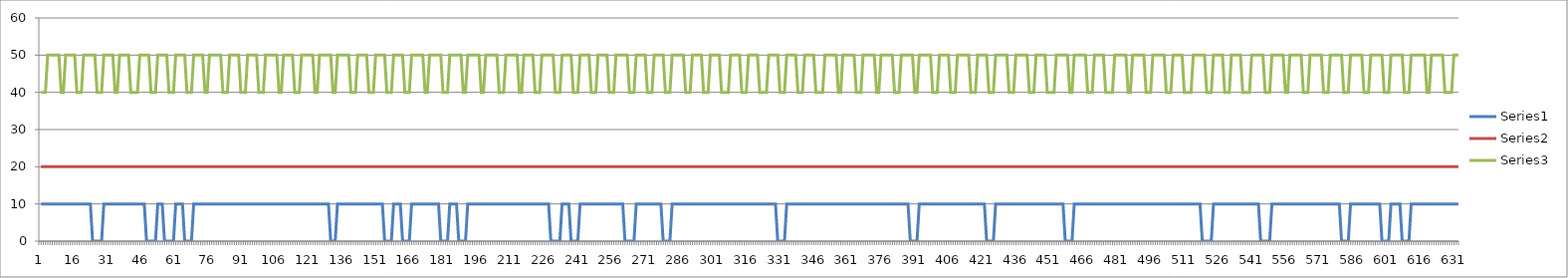
| Category | Series 0 | Series 1 | Series 2 |
|---|---|---|---|
| 0 | 10 | 20 | 40 |
| 1 | 10 | 20 | 40 |
| 2 | 10 | 20 | 40 |
| 3 | 10 | 20 | 50 |
| 4 | 10 | 20 | 50 |
| 5 | 10 | 20 | 50 |
| 6 | 10 | 20 | 50 |
| 7 | 10 | 20 | 50 |
| 8 | 10 | 20 | 50 |
| 9 | 10 | 20 | 40 |
| 10 | 10 | 20 | 40 |
| 11 | 10 | 20 | 50 |
| 12 | 10 | 20 | 50 |
| 13 | 10 | 20 | 50 |
| 14 | 10 | 20 | 50 |
| 15 | 10 | 20 | 50 |
| 16 | 10 | 20 | 40 |
| 17 | 10 | 20 | 40 |
| 18 | 10 | 20 | 40 |
| 19 | 10 | 20 | 50 |
| 20 | 10 | 20 | 50 |
| 21 | 10 | 20 | 50 |
| 22 | 10 | 20 | 50 |
| 23 | 0 | 20 | 50 |
| 24 | 0 | 20 | 50 |
| 25 | 0 | 20 | 40 |
| 26 | 0 | 20 | 40 |
| 27 | 0 | 20 | 40 |
| 28 | 10 | 20 | 50 |
| 29 | 10 | 20 | 50 |
| 30 | 10 | 20 | 50 |
| 31 | 10 | 20 | 50 |
| 32 | 10 | 20 | 50 |
| 33 | 10 | 20 | 40 |
| 34 | 10 | 20 | 40 |
| 35 | 10 | 20 | 50 |
| 36 | 10 | 20 | 50 |
| 37 | 10 | 20 | 50 |
| 38 | 10 | 20 | 50 |
| 39 | 10 | 20 | 50 |
| 40 | 10 | 20 | 40 |
| 41 | 10 | 20 | 40 |
| 42 | 10 | 20 | 40 |
| 43 | 10 | 20 | 40 |
| 44 | 10 | 20 | 50 |
| 45 | 10 | 20 | 50 |
| 46 | 10 | 20 | 50 |
| 47 | 0 | 20 | 50 |
| 48 | 0 | 20 | 50 |
| 49 | 0 | 20 | 40 |
| 50 | 0 | 20 | 40 |
| 51 | 0 | 20 | 40 |
| 52 | 10 | 20 | 50 |
| 53 | 10 | 20 | 50 |
| 54 | 10 | 20 | 50 |
| 55 | 0 | 20 | 50 |
| 56 | 0 | 20 | 50 |
| 57 | 0 | 20 | 40 |
| 58 | 0 | 20 | 40 |
| 59 | 0 | 20 | 40 |
| 60 | 10 | 20 | 50 |
| 61 | 10 | 20 | 50 |
| 62 | 10 | 20 | 50 |
| 63 | 10 | 20 | 50 |
| 64 | 0 | 20 | 50 |
| 65 | 0 | 20 | 40 |
| 66 | 0 | 20 | 40 |
| 67 | 0 | 20 | 40 |
| 68 | 10 | 20 | 50 |
| 69 | 10 | 20 | 50 |
| 70 | 10 | 20 | 50 |
| 71 | 10 | 20 | 50 |
| 72 | 10 | 20 | 50 |
| 73 | 10 | 20 | 40 |
| 74 | 10 | 20 | 40 |
| 75 | 10 | 20 | 50 |
| 76 | 10 | 20 | 50 |
| 77 | 10 | 20 | 50 |
| 78 | 10 | 20 | 50 |
| 79 | 10 | 20 | 50 |
| 80 | 10 | 20 | 50 |
| 81 | 10 | 20 | 40 |
| 82 | 10 | 20 | 40 |
| 83 | 10 | 20 | 40 |
| 84 | 10 | 20 | 50 |
| 85 | 10 | 20 | 50 |
| 86 | 10 | 20 | 50 |
| 87 | 10 | 20 | 50 |
| 88 | 10 | 20 | 50 |
| 89 | 10 | 20 | 40 |
| 90 | 10 | 20 | 40 |
| 91 | 10 | 20 | 40 |
| 92 | 10 | 20 | 50 |
| 93 | 10 | 20 | 50 |
| 94 | 10 | 20 | 50 |
| 95 | 10 | 20 | 50 |
| 96 | 10 | 20 | 50 |
| 97 | 10 | 20 | 40 |
| 98 | 10 | 20 | 40 |
| 99 | 10 | 20 | 40 |
| 100 | 10 | 20 | 50 |
| 101 | 10 | 20 | 50 |
| 102 | 10 | 20 | 50 |
| 103 | 10 | 20 | 50 |
| 104 | 10 | 20 | 50 |
| 105 | 10 | 20 | 50 |
| 106 | 10 | 20 | 40 |
| 107 | 10 | 20 | 40 |
| 108 | 10 | 20 | 50 |
| 109 | 10 | 20 | 50 |
| 110 | 10 | 20 | 50 |
| 111 | 10 | 20 | 50 |
| 112 | 10 | 20 | 50 |
| 113 | 10 | 20 | 40 |
| 114 | 10 | 20 | 40 |
| 115 | 10 | 20 | 40 |
| 116 | 10 | 20 | 50 |
| 117 | 10 | 20 | 50 |
| 118 | 10 | 20 | 50 |
| 119 | 10 | 20 | 50 |
| 120 | 10 | 20 | 50 |
| 121 | 10 | 20 | 50 |
| 122 | 10 | 20 | 40 |
| 123 | 10 | 20 | 40 |
| 124 | 10 | 20 | 50 |
| 125 | 10 | 20 | 50 |
| 126 | 10 | 20 | 50 |
| 127 | 10 | 20 | 50 |
| 128 | 10 | 20 | 50 |
| 129 | 0 | 20 | 50 |
| 130 | 0 | 20 | 40 |
| 131 | 0 | 20 | 40 |
| 132 | 10 | 20 | 50 |
| 133 | 10 | 20 | 50 |
| 134 | 10 | 20 | 50 |
| 135 | 10 | 20 | 50 |
| 136 | 10 | 20 | 50 |
| 137 | 10 | 20 | 50 |
| 138 | 10 | 20 | 40 |
| 139 | 10 | 20 | 40 |
| 140 | 10 | 20 | 40 |
| 141 | 10 | 20 | 50 |
| 142 | 10 | 20 | 50 |
| 143 | 10 | 20 | 50 |
| 144 | 10 | 20 | 50 |
| 145 | 10 | 20 | 50 |
| 146 | 10 | 20 | 40 |
| 147 | 10 | 20 | 40 |
| 148 | 10 | 20 | 40 |
| 149 | 10 | 20 | 50 |
| 150 | 10 | 20 | 50 |
| 151 | 10 | 20 | 50 |
| 152 | 10 | 20 | 50 |
| 153 | 0 | 20 | 50 |
| 154 | 0 | 20 | 40 |
| 155 | 0 | 20 | 40 |
| 156 | 0 | 20 | 40 |
| 157 | 10 | 20 | 50 |
| 158 | 10 | 20 | 50 |
| 159 | 10 | 20 | 50 |
| 160 | 10 | 20 | 50 |
| 161 | 0 | 20 | 50 |
| 162 | 0 | 20 | 40 |
| 163 | 0 | 20 | 40 |
| 164 | 0 | 20 | 40 |
| 165 | 10 | 20 | 50 |
| 166 | 10 | 20 | 50 |
| 167 | 10 | 20 | 50 |
| 168 | 10 | 20 | 50 |
| 169 | 10 | 20 | 50 |
| 170 | 10 | 20 | 50 |
| 171 | 10 | 20 | 40 |
| 172 | 10 | 20 | 40 |
| 173 | 10 | 20 | 50 |
| 174 | 10 | 20 | 50 |
| 175 | 10 | 20 | 50 |
| 176 | 10 | 20 | 50 |
| 177 | 10 | 20 | 50 |
| 178 | 0 | 20 | 50 |
| 179 | 0 | 20 | 40 |
| 180 | 0 | 20 | 40 |
| 181 | 0 | 20 | 40 |
| 182 | 10 | 20 | 50 |
| 183 | 10 | 20 | 50 |
| 184 | 10 | 20 | 50 |
| 185 | 10 | 20 | 50 |
| 186 | 0 | 20 | 50 |
| 187 | 0 | 20 | 50 |
| 188 | 0 | 20 | 40 |
| 189 | 0 | 20 | 40 |
| 190 | 10 | 20 | 50 |
| 191 | 10 | 20 | 50 |
| 192 | 10 | 20 | 50 |
| 193 | 10 | 20 | 50 |
| 194 | 10 | 20 | 50 |
| 195 | 10 | 20 | 50 |
| 196 | 10 | 20 | 40 |
| 197 | 10 | 20 | 40 |
| 198 | 10 | 20 | 50 |
| 199 | 10 | 20 | 50 |
| 200 | 10 | 20 | 50 |
| 201 | 10 | 20 | 50 |
| 202 | 10 | 20 | 50 |
| 203 | 10 | 20 | 50 |
| 204 | 10 | 20 | 40 |
| 205 | 10 | 20 | 40 |
| 206 | 10 | 20 | 40 |
| 207 | 10 | 20 | 50 |
| 208 | 10 | 20 | 50 |
| 209 | 10 | 20 | 50 |
| 210 | 10 | 20 | 50 |
| 211 | 10 | 20 | 50 |
| 212 | 10 | 20 | 50 |
| 213 | 10 | 20 | 40 |
| 214 | 10 | 20 | 40 |
| 215 | 10 | 20 | 50 |
| 216 | 10 | 20 | 50 |
| 217 | 10 | 20 | 50 |
| 218 | 10 | 20 | 50 |
| 219 | 10 | 20 | 50 |
| 220 | 10 | 20 | 40 |
| 221 | 10 | 20 | 40 |
| 222 | 10 | 20 | 40 |
| 223 | 10 | 20 | 50 |
| 224 | 10 | 20 | 50 |
| 225 | 10 | 20 | 50 |
| 226 | 10 | 20 | 50 |
| 227 | 0 | 20 | 50 |
| 228 | 0 | 20 | 50 |
| 229 | 0 | 20 | 40 |
| 230 | 0 | 20 | 40 |
| 231 | 0 | 20 | 40 |
| 232 | 10 | 20 | 50 |
| 233 | 10 | 20 | 50 |
| 234 | 10 | 20 | 50 |
| 235 | 10 | 20 | 50 |
| 236 | 0 | 20 | 50 |
| 237 | 0 | 20 | 40 |
| 238 | 0 | 20 | 40 |
| 239 | 0 | 20 | 40 |
| 240 | 10 | 20 | 50 |
| 241 | 10 | 20 | 50 |
| 242 | 10 | 20 | 50 |
| 243 | 10 | 20 | 50 |
| 244 | 10 | 20 | 50 |
| 245 | 10 | 20 | 40 |
| 246 | 10 | 20 | 40 |
| 247 | 10 | 20 | 40 |
| 248 | 10 | 20 | 50 |
| 249 | 10 | 20 | 50 |
| 250 | 10 | 20 | 50 |
| 251 | 10 | 20 | 50 |
| 252 | 10 | 20 | 50 |
| 253 | 10 | 20 | 40 |
| 254 | 10 | 20 | 40 |
| 255 | 10 | 20 | 40 |
| 256 | 10 | 20 | 50 |
| 257 | 10 | 20 | 50 |
| 258 | 10 | 20 | 50 |
| 259 | 10 | 20 | 50 |
| 260 | 0 | 20 | 50 |
| 261 | 0 | 20 | 50 |
| 262 | 0 | 20 | 40 |
| 263 | 0 | 20 | 40 |
| 264 | 0 | 20 | 40 |
| 265 | 10 | 20 | 50 |
| 266 | 10 | 20 | 50 |
| 267 | 10 | 20 | 50 |
| 268 | 10 | 20 | 50 |
| 269 | 10 | 20 | 50 |
| 270 | 10 | 20 | 40 |
| 271 | 10 | 20 | 40 |
| 272 | 10 | 20 | 40 |
| 273 | 10 | 20 | 50 |
| 274 | 10 | 20 | 50 |
| 275 | 10 | 20 | 50 |
| 276 | 10 | 20 | 50 |
| 277 | 0 | 20 | 50 |
| 278 | 0 | 20 | 40 |
| 279 | 0 | 20 | 40 |
| 280 | 0 | 20 | 40 |
| 281 | 10 | 20 | 50 |
| 282 | 10 | 20 | 50 |
| 283 | 10 | 20 | 50 |
| 284 | 10 | 20 | 50 |
| 285 | 10 | 20 | 50 |
| 286 | 10 | 20 | 50 |
| 287 | 10 | 20 | 40 |
| 288 | 10 | 20 | 40 |
| 289 | 10 | 20 | 40 |
| 290 | 10 | 20 | 50 |
| 291 | 10 | 20 | 50 |
| 292 | 10 | 20 | 50 |
| 293 | 10 | 20 | 50 |
| 294 | 10 | 20 | 50 |
| 295 | 10 | 20 | 40 |
| 296 | 10 | 20 | 40 |
| 297 | 10 | 20 | 40 |
| 298 | 10 | 20 | 50 |
| 299 | 10 | 20 | 50 |
| 300 | 10 | 20 | 50 |
| 301 | 10 | 20 | 50 |
| 302 | 10 | 20 | 50 |
| 303 | 10 | 20 | 40 |
| 304 | 10 | 20 | 40 |
| 305 | 10 | 20 | 40 |
| 306 | 10 | 20 | 40 |
| 307 | 10 | 20 | 50 |
| 308 | 10 | 20 | 50 |
| 309 | 10 | 20 | 50 |
| 310 | 10 | 20 | 50 |
| 311 | 10 | 20 | 50 |
| 312 | 10 | 20 | 40 |
| 313 | 10 | 20 | 40 |
| 314 | 10 | 20 | 40 |
| 315 | 10 | 20 | 50 |
| 316 | 10 | 20 | 50 |
| 317 | 10 | 20 | 50 |
| 318 | 10 | 20 | 50 |
| 319 | 10 | 20 | 50 |
| 320 | 10 | 20 | 40 |
| 321 | 10 | 20 | 40 |
| 322 | 10 | 20 | 40 |
| 323 | 10 | 20 | 40 |
| 324 | 10 | 20 | 50 |
| 325 | 10 | 20 | 50 |
| 326 | 10 | 20 | 50 |
| 327 | 10 | 20 | 50 |
| 328 | 0 | 20 | 50 |
| 329 | 0 | 20 | 40 |
| 330 | 0 | 20 | 40 |
| 331 | 0 | 20 | 40 |
| 332 | 10 | 20 | 50 |
| 333 | 10 | 20 | 50 |
| 334 | 10 | 20 | 50 |
| 335 | 10 | 20 | 50 |
| 336 | 10 | 20 | 50 |
| 337 | 10 | 20 | 40 |
| 338 | 10 | 20 | 40 |
| 339 | 10 | 20 | 40 |
| 340 | 10 | 20 | 50 |
| 341 | 10 | 20 | 50 |
| 342 | 10 | 20 | 50 |
| 343 | 10 | 20 | 50 |
| 344 | 10 | 20 | 50 |
| 345 | 10 | 20 | 40 |
| 346 | 10 | 20 | 40 |
| 347 | 10 | 20 | 40 |
| 348 | 10 | 20 | 40 |
| 349 | 10 | 20 | 50 |
| 350 | 10 | 20 | 50 |
| 351 | 10 | 20 | 50 |
| 352 | 10 | 20 | 50 |
| 353 | 10 | 20 | 50 |
| 354 | 10 | 20 | 50 |
| 355 | 10 | 20 | 40 |
| 356 | 10 | 20 | 40 |
| 357 | 10 | 20 | 50 |
| 358 | 10 | 20 | 50 |
| 359 | 10 | 20 | 50 |
| 360 | 10 | 20 | 50 |
| 361 | 10 | 20 | 50 |
| 362 | 10 | 20 | 50 |
| 363 | 10 | 20 | 40 |
| 364 | 10 | 20 | 40 |
| 365 | 10 | 20 | 40 |
| 366 | 10 | 20 | 50 |
| 367 | 10 | 20 | 50 |
| 368 | 10 | 20 | 50 |
| 369 | 10 | 20 | 50 |
| 370 | 10 | 20 | 50 |
| 371 | 10 | 20 | 50 |
| 372 | 10 | 20 | 40 |
| 373 | 10 | 20 | 40 |
| 374 | 10 | 20 | 50 |
| 375 | 10 | 20 | 50 |
| 376 | 10 | 20 | 50 |
| 377 | 10 | 20 | 50 |
| 378 | 10 | 20 | 50 |
| 379 | 10 | 20 | 50 |
| 380 | 10 | 20 | 40 |
| 381 | 10 | 20 | 40 |
| 382 | 10 | 20 | 40 |
| 383 | 10 | 20 | 50 |
| 384 | 10 | 20 | 50 |
| 385 | 10 | 20 | 50 |
| 386 | 10 | 20 | 50 |
| 387 | 0 | 20 | 50 |
| 388 | 0 | 20 | 50 |
| 389 | 0 | 20 | 40 |
| 390 | 0 | 20 | 40 |
| 391 | 10 | 20 | 50 |
| 392 | 10 | 20 | 50 |
| 393 | 10 | 20 | 50 |
| 394 | 10 | 20 | 50 |
| 395 | 10 | 20 | 50 |
| 396 | 10 | 20 | 50 |
| 397 | 10 | 20 | 40 |
| 398 | 10 | 20 | 40 |
| 399 | 10 | 20 | 40 |
| 400 | 10 | 20 | 50 |
| 401 | 10 | 20 | 50 |
| 402 | 10 | 20 | 50 |
| 403 | 10 | 20 | 50 |
| 404 | 10 | 20 | 50 |
| 405 | 10 | 20 | 40 |
| 406 | 10 | 20 | 40 |
| 407 | 10 | 20 | 40 |
| 408 | 10 | 20 | 50 |
| 409 | 10 | 20 | 50 |
| 410 | 10 | 20 | 50 |
| 411 | 10 | 20 | 50 |
| 412 | 10 | 20 | 50 |
| 413 | 10 | 20 | 50 |
| 414 | 10 | 20 | 40 |
| 415 | 10 | 20 | 40 |
| 416 | 10 | 20 | 40 |
| 417 | 10 | 20 | 50 |
| 418 | 10 | 20 | 50 |
| 419 | 10 | 20 | 50 |
| 420 | 10 | 20 | 50 |
| 421 | 0 | 20 | 50 |
| 422 | 0 | 20 | 40 |
| 423 | 0 | 20 | 40 |
| 424 | 0 | 20 | 40 |
| 425 | 10 | 20 | 50 |
| 426 | 10 | 20 | 50 |
| 427 | 10 | 20 | 50 |
| 428 | 10 | 20 | 50 |
| 429 | 10 | 20 | 50 |
| 430 | 10 | 20 | 50 |
| 431 | 10 | 20 | 40 |
| 432 | 10 | 20 | 40 |
| 433 | 10 | 20 | 40 |
| 434 | 10 | 20 | 50 |
| 435 | 10 | 20 | 50 |
| 436 | 10 | 20 | 50 |
| 437 | 10 | 20 | 50 |
| 438 | 10 | 20 | 50 |
| 439 | 10 | 20 | 50 |
| 440 | 10 | 20 | 40 |
| 441 | 10 | 20 | 40 |
| 442 | 10 | 20 | 40 |
| 443 | 10 | 20 | 50 |
| 444 | 10 | 20 | 50 |
| 445 | 10 | 20 | 50 |
| 446 | 10 | 20 | 50 |
| 447 | 10 | 20 | 50 |
| 448 | 10 | 20 | 40 |
| 449 | 10 | 20 | 40 |
| 450 | 10 | 20 | 40 |
| 451 | 10 | 20 | 40 |
| 452 | 10 | 20 | 50 |
| 453 | 10 | 20 | 50 |
| 454 | 10 | 20 | 50 |
| 455 | 10 | 20 | 50 |
| 456 | 0 | 20 | 50 |
| 457 | 0 | 20 | 50 |
| 458 | 0 | 20 | 40 |
| 459 | 0 | 20 | 40 |
| 460 | 10 | 20 | 50 |
| 461 | 10 | 20 | 50 |
| 462 | 10 | 20 | 50 |
| 463 | 10 | 20 | 50 |
| 464 | 10 | 20 | 50 |
| 465 | 10 | 20 | 50 |
| 466 | 10 | 20 | 40 |
| 467 | 10 | 20 | 40 |
| 468 | 10 | 20 | 40 |
| 469 | 10 | 20 | 50 |
| 470 | 10 | 20 | 50 |
| 471 | 10 | 20 | 50 |
| 472 | 10 | 20 | 50 |
| 473 | 10 | 20 | 50 |
| 474 | 10 | 20 | 40 |
| 475 | 10 | 20 | 40 |
| 476 | 10 | 20 | 40 |
| 477 | 10 | 20 | 40 |
| 478 | 10 | 20 | 50 |
| 479 | 10 | 20 | 50 |
| 480 | 10 | 20 | 50 |
| 481 | 10 | 20 | 50 |
| 482 | 10 | 20 | 50 |
| 483 | 10 | 20 | 50 |
| 484 | 10 | 20 | 40 |
| 485 | 10 | 20 | 40 |
| 486 | 10 | 20 | 50 |
| 487 | 10 | 20 | 50 |
| 488 | 10 | 20 | 50 |
| 489 | 10 | 20 | 50 |
| 490 | 10 | 20 | 50 |
| 491 | 10 | 20 | 50 |
| 492 | 10 | 20 | 40 |
| 493 | 10 | 20 | 40 |
| 494 | 10 | 20 | 40 |
| 495 | 10 | 20 | 50 |
| 496 | 10 | 20 | 50 |
| 497 | 10 | 20 | 50 |
| 498 | 10 | 20 | 50 |
| 499 | 10 | 20 | 50 |
| 500 | 10 | 20 | 50 |
| 501 | 10 | 20 | 40 |
| 502 | 10 | 20 | 40 |
| 503 | 10 | 20 | 40 |
| 504 | 10 | 20 | 50 |
| 505 | 10 | 20 | 50 |
| 506 | 10 | 20 | 50 |
| 507 | 10 | 20 | 50 |
| 508 | 10 | 20 | 50 |
| 509 | 10 | 20 | 40 |
| 510 | 10 | 20 | 40 |
| 511 | 10 | 20 | 40 |
| 512 | 10 | 20 | 40 |
| 513 | 10 | 20 | 50 |
| 514 | 10 | 20 | 50 |
| 515 | 10 | 20 | 50 |
| 516 | 10 | 20 | 50 |
| 517 | 0 | 20 | 50 |
| 518 | 0 | 20 | 50 |
| 519 | 0 | 20 | 40 |
| 520 | 0 | 20 | 40 |
| 521 | 0 | 20 | 40 |
| 522 | 10 | 20 | 50 |
| 523 | 10 | 20 | 50 |
| 524 | 10 | 20 | 50 |
| 525 | 10 | 20 | 50 |
| 526 | 10 | 20 | 50 |
| 527 | 10 | 20 | 40 |
| 528 | 10 | 20 | 40 |
| 529 | 10 | 20 | 40 |
| 530 | 10 | 20 | 50 |
| 531 | 10 | 20 | 50 |
| 532 | 10 | 20 | 50 |
| 533 | 10 | 20 | 50 |
| 534 | 10 | 20 | 50 |
| 535 | 10 | 20 | 40 |
| 536 | 10 | 20 | 40 |
| 537 | 10 | 20 | 40 |
| 538 | 10 | 20 | 40 |
| 539 | 10 | 20 | 50 |
| 540 | 10 | 20 | 50 |
| 541 | 10 | 20 | 50 |
| 542 | 10 | 20 | 50 |
| 543 | 0 | 20 | 50 |
| 544 | 0 | 20 | 50 |
| 545 | 0 | 20 | 40 |
| 546 | 0 | 20 | 40 |
| 547 | 0 | 20 | 40 |
| 548 | 10 | 20 | 50 |
| 549 | 10 | 20 | 50 |
| 550 | 10 | 20 | 50 |
| 551 | 10 | 20 | 50 |
| 552 | 10 | 20 | 50 |
| 553 | 10 | 20 | 50 |
| 554 | 10 | 20 | 40 |
| 555 | 10 | 20 | 40 |
| 556 | 10 | 20 | 50 |
| 557 | 10 | 20 | 50 |
| 558 | 10 | 20 | 50 |
| 559 | 10 | 20 | 50 |
| 560 | 10 | 20 | 50 |
| 561 | 10 | 20 | 50 |
| 562 | 10 | 20 | 40 |
| 563 | 10 | 20 | 40 |
| 564 | 10 | 20 | 40 |
| 565 | 10 | 20 | 50 |
| 566 | 10 | 20 | 50 |
| 567 | 10 | 20 | 50 |
| 568 | 10 | 20 | 50 |
| 569 | 10 | 20 | 50 |
| 570 | 10 | 20 | 50 |
| 571 | 10 | 20 | 40 |
| 572 | 10 | 20 | 40 |
| 573 | 10 | 20 | 40 |
| 574 | 10 | 20 | 50 |
| 575 | 10 | 20 | 50 |
| 576 | 10 | 20 | 50 |
| 577 | 10 | 20 | 50 |
| 578 | 10 | 20 | 50 |
| 579 | 0 | 20 | 50 |
| 580 | 0 | 20 | 40 |
| 581 | 0 | 20 | 40 |
| 582 | 0 | 20 | 40 |
| 583 | 10 | 20 | 50 |
| 584 | 10 | 20 | 50 |
| 585 | 10 | 20 | 50 |
| 586 | 10 | 20 | 50 |
| 587 | 10 | 20 | 50 |
| 588 | 10 | 20 | 50 |
| 589 | 10 | 20 | 40 |
| 590 | 10 | 20 | 40 |
| 591 | 10 | 20 | 40 |
| 592 | 10 | 20 | 50 |
| 593 | 10 | 20 | 50 |
| 594 | 10 | 20 | 50 |
| 595 | 10 | 20 | 50 |
| 596 | 10 | 20 | 50 |
| 597 | 0 | 20 | 50 |
| 598 | 0 | 20 | 40 |
| 599 | 0 | 20 | 40 |
| 600 | 0 | 20 | 40 |
| 601 | 10 | 20 | 50 |
| 602 | 10 | 20 | 50 |
| 603 | 10 | 20 | 50 |
| 604 | 10 | 20 | 50 |
| 605 | 10 | 20 | 50 |
| 606 | 0 | 20 | 50 |
| 607 | 0 | 20 | 40 |
| 608 | 0 | 20 | 40 |
| 609 | 0 | 20 | 40 |
| 610 | 10 | 20 | 50 |
| 611 | 10 | 20 | 50 |
| 612 | 10 | 20 | 50 |
| 613 | 10 | 20 | 50 |
| 614 | 10 | 20 | 50 |
| 615 | 10 | 20 | 50 |
| 616 | 10 | 20 | 50 |
| 617 | 10 | 20 | 40 |
| 618 | 10 | 20 | 40 |
| 619 | 10 | 20 | 50 |
| 620 | 10 | 20 | 50 |
| 621 | 10 | 20 | 50 |
| 622 | 10 | 20 | 50 |
| 623 | 10 | 20 | 50 |
| 624 | 10 | 20 | 50 |
| 625 | 10 | 20 | 40 |
| 626 | 10 | 20 | 40 |
| 627 | 10 | 20 | 40 |
| 628 | 10 | 20 | 40 |
| 629 | 10 | 20 | 50 |
| 630 | 10 | 20 | 50 |
| 631 | 10 | 20 | 50 |